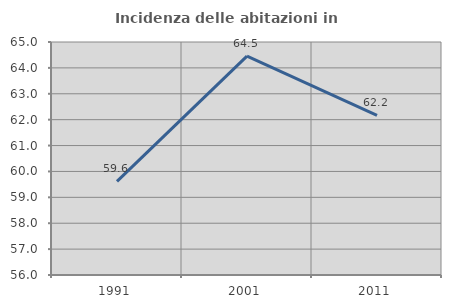
| Category | Incidenza delle abitazioni in proprietà  |
|---|---|
| 1991.0 | 59.617 |
| 2001.0 | 64.455 |
| 2011.0 | 62.163 |